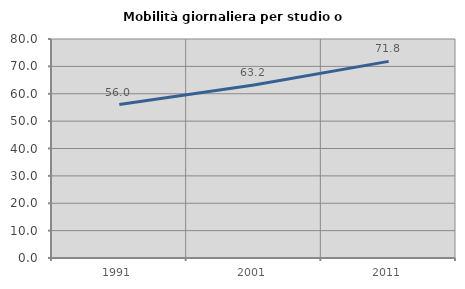
| Category | Mobilità giornaliera per studio o lavoro |
|---|---|
| 1991.0 | 56.041 |
| 2001.0 | 63.179 |
| 2011.0 | 71.835 |